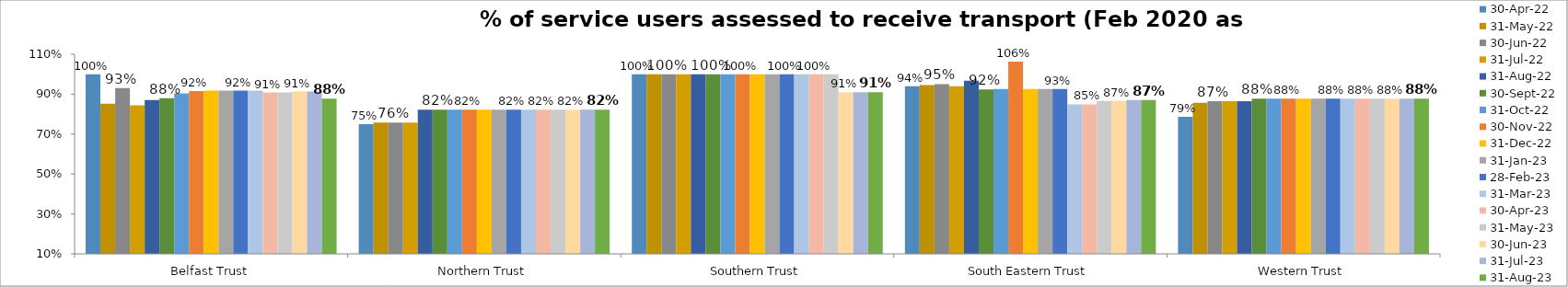
| Category | 30-Apr-22 | 31-May-22 | 30-Jun-22 | 31-Jul-22 | 31-Aug-22 | 30-Sep-22 | 31-Oct-22 | 30-Nov-22 | 31-Dec-22 | 31-Jan-23 | 28-Feb-23 | 31-Mar-23 | 30-Apr-23 | 31-May-23 | 30-Jun-23 | 31-Jul-23 | 31-Aug-23 |
|---|---|---|---|---|---|---|---|---|---|---|---|---|---|---|---|---|---|
| Belfast Trust | 1 | 0.853 | 0.931 | 0.844 | 0.871 | 0.879 | 0.904 | 0.915 | 0.917 | 0.917 | 0.917 | 0.917 | 0.908 | 0.908 | 0.913 | 0.913 | 0.877 |
| Northern Trust | 0.75 | 0.758 | 0.758 | 0.758 | 0.822 | 0.822 | 0.822 | 0.822 | 0.822 | 0.822 | 0.822 | 0.822 | 0.822 | 0.822 | 0.822 | 0.822 | 0.822 |
| Southern Trust | 1 | 1 | 1 | 1 | 1 | 1 | 1 | 1 | 1 | 1 | 1 | 1 | 1 | 1 | 0.909 | 0.909 | 0.909 |
| South Eastern Trust | 0.94 | 0.945 | 0.951 | 0.94 | 0.967 | 0.923 | 0.926 | 1.063 | 0.926 | 0.926 | 0.926 | 0.849 | 0.849 | 0.866 | 0.866 | 0.871 | 0.871 |
| Western Trust | 0.786 | 0.857 | 0.865 | 0.865 | 0.865 | 0.878 | 0.878 | 0.878 | 0.878 | 0.878 | 0.878 | 0.878 | 0.878 | 0.878 | 0.878 | 0.878 | 0.878 |